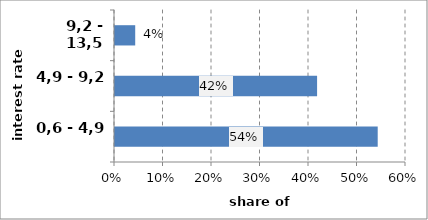
| Category | Series 0 |
|---|---|
| 0,6 - 4,9 | 0.542 |
| 4,9 - 9,2 | 0.417 |
| 9,2 - 13,5 | 0.042 |